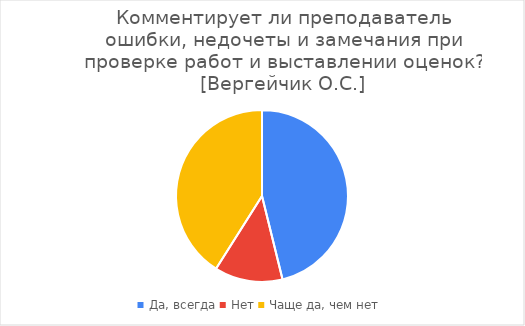
| Category | Series 0 |
|---|---|
| Да, всегда | 36 |
| Нет | 10 |
| Чаще да, чем нет | 32 |